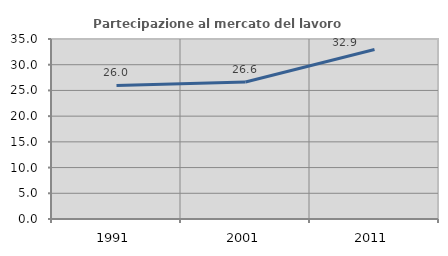
| Category | Partecipazione al mercato del lavoro  femminile |
|---|---|
| 1991.0 | 25.974 |
| 2001.0 | 26.634 |
| 2011.0 | 32.945 |